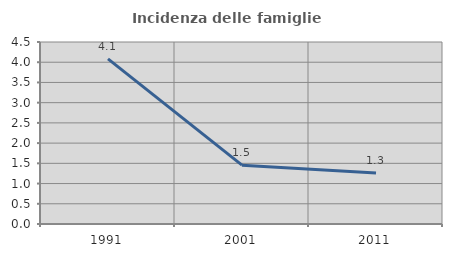
| Category | Incidenza delle famiglie numerose |
|---|---|
| 1991.0 | 4.082 |
| 2001.0 | 1.455 |
| 2011.0 | 1.26 |